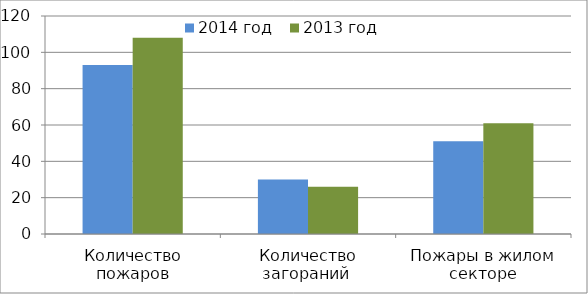
| Category | 2014 год | 2013 год |
|---|---|---|
| Количество пожаров | 93 | 108 |
| Количество загораний  | 30 | 26 |
| Пожары в жилом секторе | 51 | 61 |